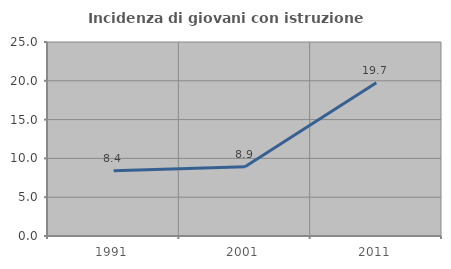
| Category | Incidenza di giovani con istruzione universitaria |
|---|---|
| 1991.0 | 8.411 |
| 2001.0 | 8.911 |
| 2011.0 | 19.737 |